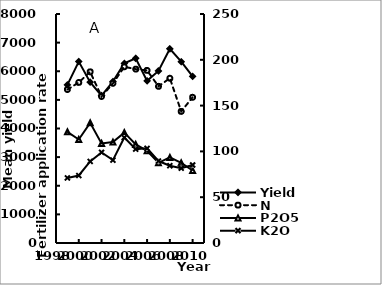
| Category | Yield |
|---|---|
| 1999.0 | 5522.477 |
| 2000.0 | 6338.92 |
| 2001.0 | 5620.615 |
| 2002.0 | 5149.95 |
| 2003.0 | 5641.086 |
| 2004.0 | 6275.411 |
| 2005.0 | 6453.032 |
| 2006.0 | 5664.454 |
| 2007.0 | 6012.684 |
| 2008.0 | 6785.322 |
| 2009.0 | 6333.978 |
| 2010.0 | 5819.014 |